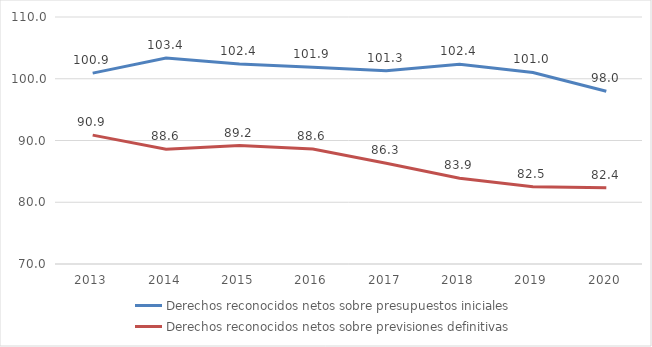
| Category | Derechos reconocidos netos sobre presupuestos iniciales | Derechos reconocidos netos sobre previsiones definitivas |
|---|---|---|
| 2013.0 | 100.916 | 90.869 |
| 2014.0 | 103.366 | 88.568 |
| 2015.0 | 102.374 | 89.179 |
| 2016.0 | 101.879 | 88.614 |
| 2017.0 | 101.302 | 86.317 |
| 2018.0 | 102.364 | 83.877 |
| 2019.0 | 101.012 | 82.52 |
| 2020.0 | 97.979 | 82.357 |